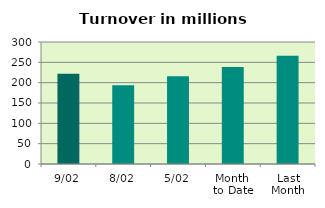
| Category | Series 0 |
|---|---|
| 9/02 | 222.096 |
| 8/02 | 193.891 |
| 5/02 | 215.608 |
| Month 
to Date | 238.295 |
| Last
Month | 265.89 |